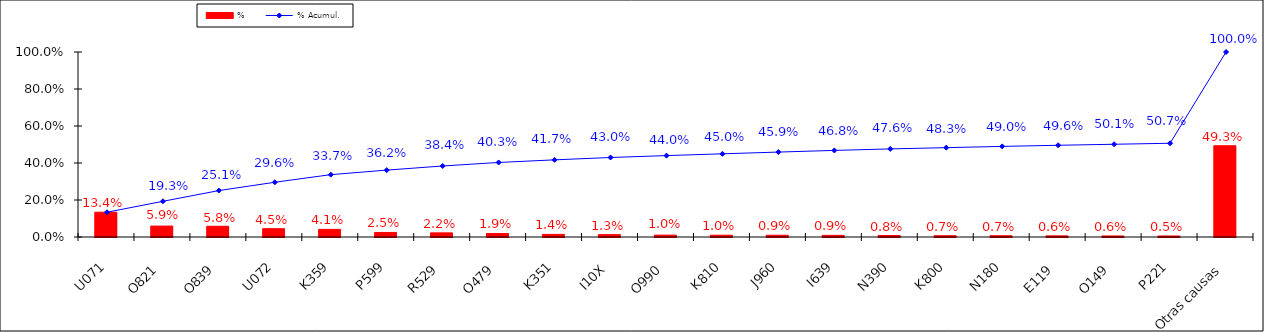
| Category | % |
|---|---|
| U071 | 0.134 |
| O821 | 0.059 |
| O839 | 0.058 |
| U072 | 0.045 |
| K359 | 0.041 |
| P599 | 0.025 |
| R529 | 0.022 |
| O479 | 0.019 |
| K351 | 0.014 |
| I10X | 0.013 |
| O990 | 0.01 |
| K810 | 0.01 |
| J960 | 0.009 |
| I639 | 0.009 |
| N390 | 0.008 |
| K800 | 0.007 |
| N180 | 0.007 |
| E119 | 0.006 |
| O149 | 0.006 |
| P221 | 0.005 |
| Otras causas | 0.493 |